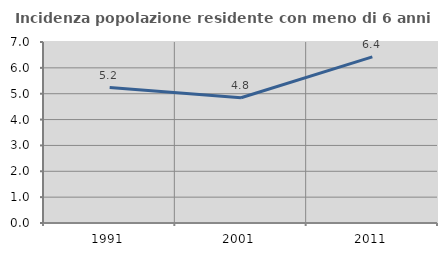
| Category | Incidenza popolazione residente con meno di 6 anni |
|---|---|
| 1991.0 | 5.237 |
| 2001.0 | 4.843 |
| 2011.0 | 6.424 |